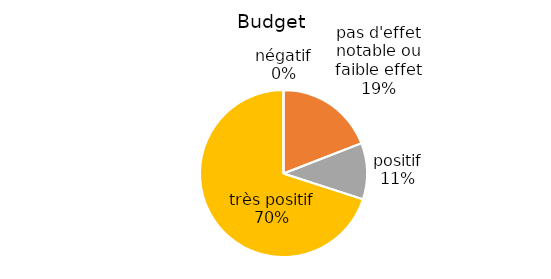
| Category | Series 0 |
|---|---|
| négatif | 0 |
| pas d'effet notable ou faible effet | 0.191 |
| positif | 0.109 |
| très positif | 0.7 |